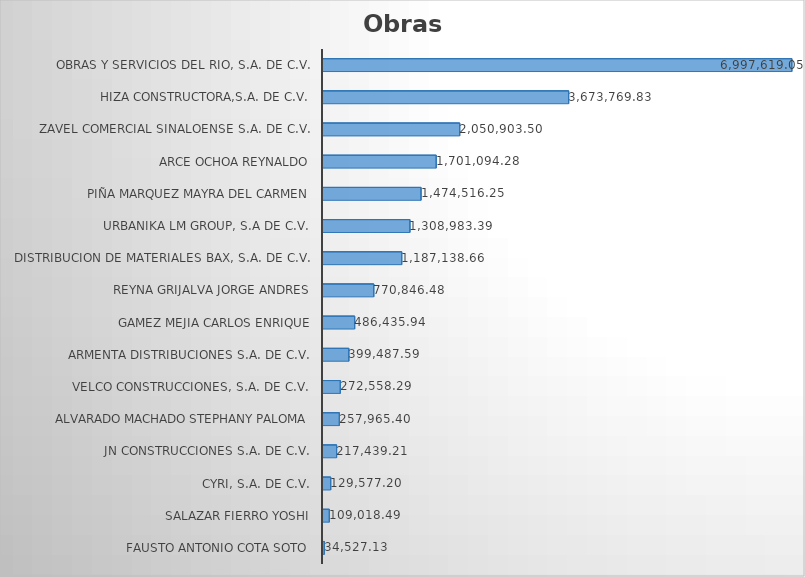
| Category | Series 0 |
|---|---|
| FAUSTO ANTONIO COTA SOTO | 34527.13 |
| SALAZAR FIERRO YOSHI | 109018.49 |
| CYRI, S.A. DE C.V. | 129577.2 |
| JN CONSTRUCCIONES S.A. DE C.V. | 217439.21 |
| ALVARADO MACHADO STEPHANY PALOMA | 257965.4 |
| VELCO CONSTRUCCIONES, S.A. DE C.V. | 272558.29 |
| ARMENTA DISTRIBUCIONES S.A. DE C.V. | 399487.59 |
| GAMEZ MEJIA CARLOS ENRIQUE | 486435.94 |
| REYNA GRIJALVA JORGE ANDRES | 770846.48 |
| DISTRIBUCION DE MATERIALES BAX, S.A. DE C.V. | 1187138.66 |
| URBANIKA LM GROUP, S.A DE C.V. | 1308983.39 |
| PIÑA MARQUEZ MAYRA DEL CARMEN | 1474516.25 |
| ARCE OCHOA REYNALDO | 1701094.28 |
| ZAVEL COMERCIAL SINALOENSE S.A. DE C.V. | 2050903.5 |
| HIZA CONSTRUCTORA,S.A. DE C.V. | 3673769.83 |
| OBRAS Y SERVICIOS DEL RIO, S.A. DE C.V. | 6997619.05 |